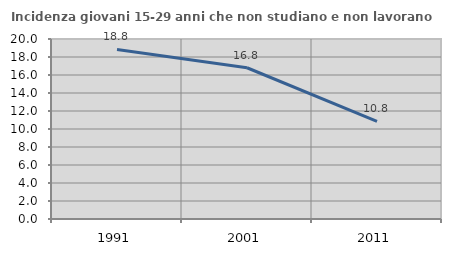
| Category | Incidenza giovani 15-29 anni che non studiano e non lavorano  |
|---|---|
| 1991.0 | 18.841 |
| 2001.0 | 16.807 |
| 2011.0 | 10.843 |